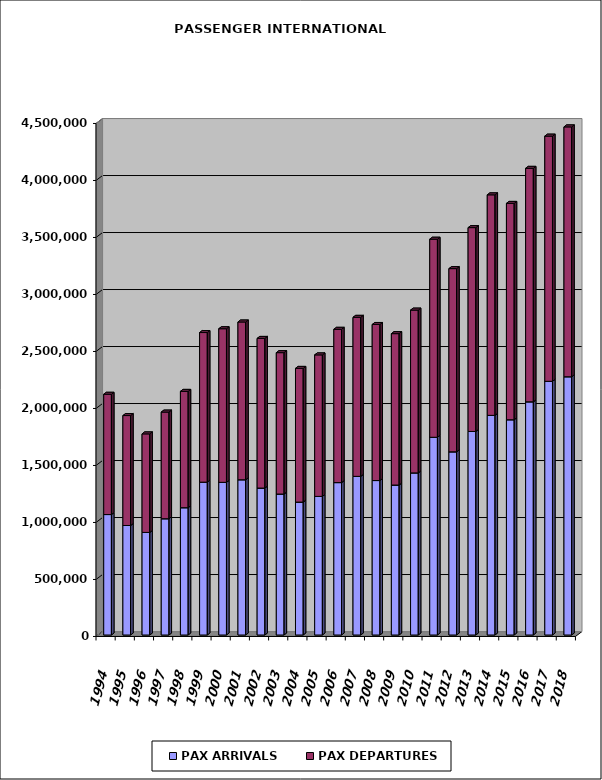
| Category | PAX ARRIVALS | PAX DEPARTURES |
|---|---|---|
| 1994.0 | 1056560 | 1055154 |
| 1995.0 | 960586 | 964336 |
| 1996.0 | 899809 | 864312 |
| 1997.0 | 1019876 | 935651 |
| 1998.0 | 1116611 | 1020417 |
| 1999.0 | 1340709 | 1312420 |
| 2000.0 | 1339139 | 1347351 |
| 2001.0 | 1361783 | 1383923 |
| 2002.0 | 1288923 | 1312723 |
| 2003.0 | 1236553 | 1240202 |
| 2004.0 | 1165843 | 1172807 |
| 2005.0 | 1215771 | 1241267 |
| 2006.0 | 1336884 | 1344673 |
| 2007.0 | 1391615 | 1395021 |
| 2008.0 | 1354921 | 1369019 |
| 2009.0 | 1315479 | 1327955 |
| 2010.0 | 1421955 | 1428051 |
| 2011.0 | 1734418 | 1737505 |
| 2012.0 | 1606843 | 1606937 |
| 2013.0 | 1785305 | 1788160 |
| 2014.0 | 1926675 | 1934341 |
| 2015.0 | 1888181 | 1897817 |
| 2016.0 | 2045555 | 2047953 |
| 2017.0 | 2225303 | 2150806 |
| 2018.0 | 2265309 | 2191817 |